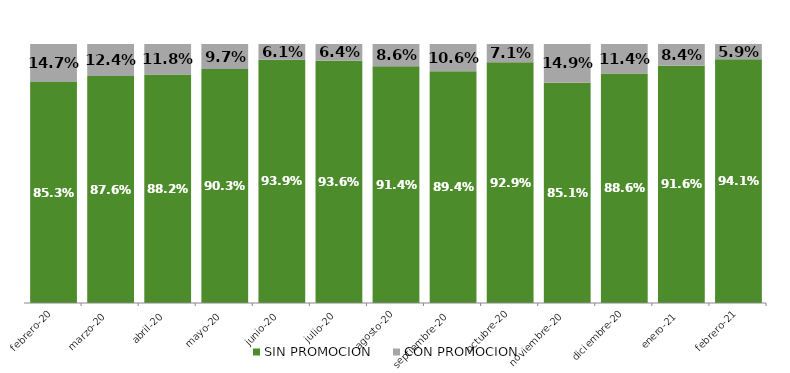
| Category | SIN PROMOCION   | CON PROMOCION   |
|---|---|---|
| 2020-02-01 | 0.853 | 0.147 |
| 2020-03-01 | 0.876 | 0.124 |
| 2020-04-01 | 0.882 | 0.118 |
| 2020-05-01 | 0.903 | 0.097 |
| 2020-06-01 | 0.939 | 0.061 |
| 2020-07-01 | 0.936 | 0.064 |
| 2020-08-01 | 0.914 | 0.086 |
| 2020-09-01 | 0.894 | 0.106 |
| 2020-10-01 | 0.929 | 0.071 |
| 2020-11-01 | 0.851 | 0.149 |
| 2020-12-01 | 0.886 | 0.114 |
| 2021-01-01 | 0.916 | 0.084 |
| 2021-02-01 | 0.941 | 0.059 |